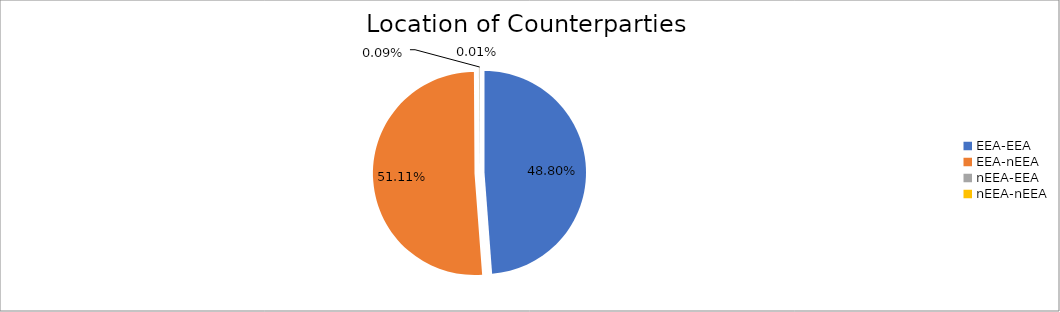
| Category | Series 0 |
|---|---|
| EEA-EEA | 5521986.287 |
| EEA-nEEA | 5783113.767 |
| nEEA-EEA | 9635.805 |
| nEEA-nEEA | 965.385 |